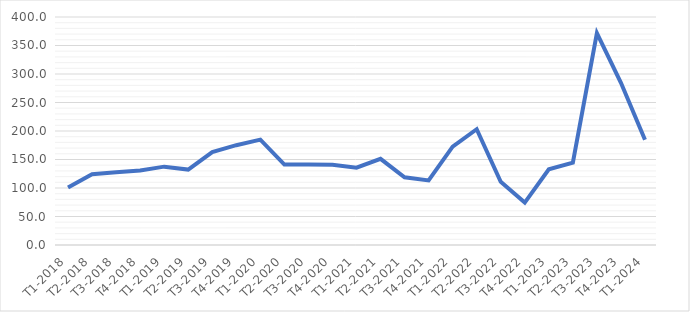
| Category | Series 0 |
|---|---|
| T1-2018 | 100.955 |
| T2-2018 | 124.158 |
| T3-2018 | 127.586 |
| T4-2018 | 130.885 |
| T1-2019 | 137.465 |
| T2-2019 | 132.352 |
| T3-2019 | 162.919 |
| T4-2019 | 175.121 |
| T1-2020 | 184.919 |
| T2-2020 | 141.043 |
| T3-2020 | 141.043 |
| T4-2020 | 140.867 |
| T1-2021 | 135.635 |
| T2-2021 | 151.239 |
| T3-2021 | 118.848 |
| T4-2021 | 113.271 |
| T1-2022 | 172.572 |
| T2-2022 | 203.15 |
| T3-2022 | 110.978 |
| T4-2022 | 74.412 |
| T1-2023 | 132.714 |
| T2-2023 | 144.478 |
| T3-2023 | 371.604 |
| T4-2023 | 284.553 |
| T1-2024 | 184.482 |